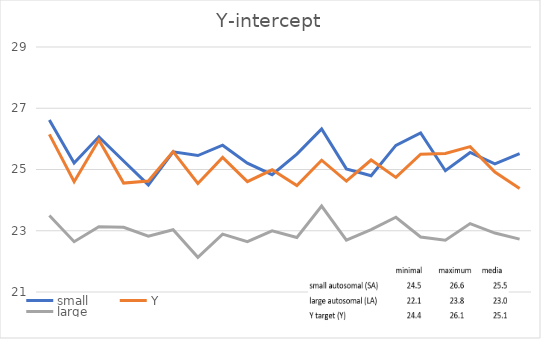
| Category | small | Y | large |
|---|---|---|---|
| 0 | 26.619 | 26.147 | 23.497 |
| 1 | 25.209 | 24.602 | 22.643 |
| 2 | 26.067 | 25.963 | 23.129 |
| 3 | 25.278 | 24.556 | 23.115 |
| 4 | 24.496 | 24.622 | 22.825 |
| 5 | 25.577 | 25.586 | 23.032 |
| 6 | 25.456 | 24.543 | 22.134 |
| 7 | 25.794 | 25.397 | 22.888 |
| 8 | 25.209 | 24.602 | 22.643 |
| 9 | 24.832 | 24.991 | 22.999 |
| 10 | 25.504 | 24.477 | 22.781 |
| 11 | 26.326 | 25.304 | 23.805 |
| 12 | 25.021 | 24.62 | 22.694 |
| 13 | 24.795 | 25.31 | 23.038 |
| 14 | 25.788 | 24.743 | 23.441 |
| 15 | 26.192 | 25.502 | 22.795 |
| 16 | 24.96 | 25.523 | 22.69 |
| 17 | 25.555 | 25.747 | 23.234 |
| 18 | 25.184 | 24.916 | 22.925 |
| 19 | 25.516 | 24.38 | 22.726 |